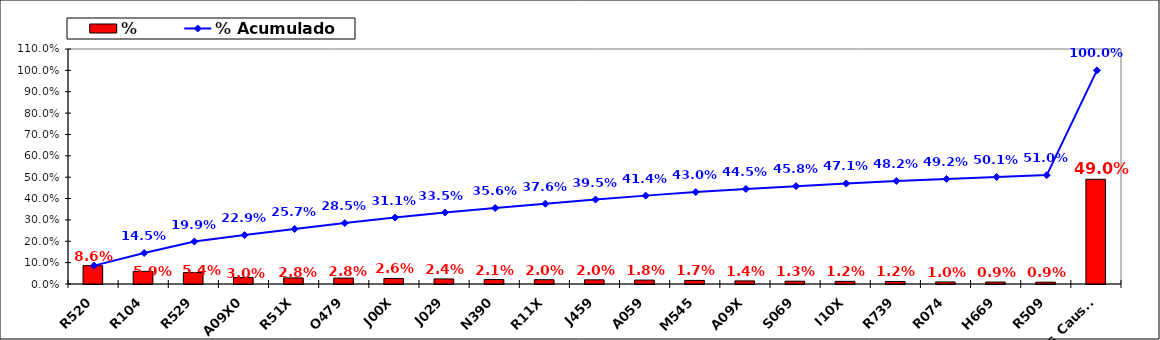
| Category | % |
|---|---|
| R520 | 0.086 |
| R104 | 0.059 |
| R529 | 0.054 |
| A09X0 | 0.03 |
| R51X | 0.028 |
| O479 | 0.028 |
| J00X | 0.026 |
| J029 | 0.024 |
| N390 | 0.021 |
| R11X | 0.02 |
| J459 | 0.02 |
| A059 | 0.018 |
| M545 | 0.017 |
| A09X | 0.014 |
| S069 | 0.013 |
| I10X | 0.012 |
| R739 | 0.012 |
| R074 | 0.01 |
| H669 | 0.009 |
| R509 | 0.009 |
| Otras Causas | 0.49 |